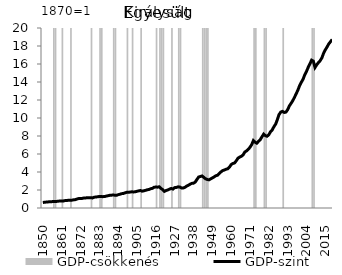
| Category | GDP-csökkenés |
|---|---|
| 1850.0 | 0 |
| 1851.0 | 0 |
| 1852.0 | 0 |
| 1853.0 | 0 |
| 1854.0 | 0 |
| 1855.0 | 0 |
| 1856.0 | 0 |
| 1857.0 | 20 |
| 1858.0 | 20 |
| 1859.0 | 0 |
| 1860.0 | 0 |
| 1861.0 | 0 |
| 1862.0 | 20 |
| 1863.0 | 0 |
| 1864.0 | 0 |
| 1865.0 | 0 |
| 1866.0 | 0 |
| 1867.0 | 20 |
| 1868.0 | 0 |
| 1869.0 | 0 |
| 1870.0 | 0 |
| 1871.0 | 0 |
| 1872.0 | 0 |
| 1873.0 | 0 |
| 1874.0 | 0 |
| 1875.0 | 0 |
| 1876.0 | 0 |
| 1877.0 | 0 |
| 1878.0 | 0 |
| 1879.0 | 20 |
| 1880.0 | 0 |
| 1881.0 | 0 |
| 1882.0 | 0 |
| 1883.0 | 0 |
| 1884.0 | 20 |
| 1885.0 | 20 |
| 1886.0 | 0 |
| 1887.0 | 0 |
| 1888.0 | 0 |
| 1889.0 | 0 |
| 1890.0 | 0 |
| 1891.0 | 0 |
| 1892.0 | 20 |
| 1893.0 | 20 |
| 1894.0 | 0 |
| 1895.0 | 0 |
| 1896.0 | 0 |
| 1897.0 | 0 |
| 1898.0 | 0 |
| 1899.0 | 0 |
| 1900.0 | 20 |
| 1901.0 | 0 |
| 1902.0 | 0 |
| 1903.0 | 20 |
| 1904.0 | 0 |
| 1905.0 | 0 |
| 1906.0 | 0 |
| 1907.0 | 0 |
| 1908.0 | 20 |
| 1909.0 | 0 |
| 1910.0 | 0 |
| 1911.0 | 0 |
| 1912.0 | 0 |
| 1913.0 | 0 |
| 1914.0 | 0 |
| 1915.0 | 0 |
| 1916.0 | 0 |
| 1917.0 | 20 |
| 1918.0 | 0 |
| 1919.0 | 20 |
| 1920.0 | 20 |
| 1921.0 | 20 |
| 1922.0 | 0 |
| 1923.0 | 0 |
| 1924.0 | 0 |
| 1925.0 | 0 |
| 1926.0 | 20 |
| 1927.0 | 0 |
| 1928.0 | 0 |
| 1929.0 | 0 |
| 1930.0 | 20 |
| 1931.0 | 20 |
| 1932.0 | 0 |
| 1933.0 | 0 |
| 1934.0 | 0 |
| 1935.0 | 0 |
| 1936.0 | 0 |
| 1937.0 | 0 |
| 1938.0 | 0 |
| 1939.0 | 0 |
| 1940.0 | 0 |
| 1941.0 | 0 |
| 1942.0 | 0 |
| 1943.0 | 0 |
| 1944.0 | 20 |
| 1945.0 | 20 |
| 1946.0 | 20 |
| 1947.0 | 20 |
| 1948.0 | 0 |
| 1949.0 | 0 |
| 1950.0 | 0 |
| 1951.0 | 0 |
| 1952.0 | 0 |
| 1953.0 | 0 |
| 1954.0 | 0 |
| 1955.0 | 0 |
| 1956.0 | 0 |
| 1957.0 | 0 |
| 1958.0 | 0 |
| 1959.0 | 0 |
| 1960.0 | 0 |
| 1961.0 | 0 |
| 1962.0 | 0 |
| 1963.0 | 0 |
| 1964.0 | 0 |
| 1965.0 | 0 |
| 1966.0 | 0 |
| 1967.0 | 0 |
| 1968.0 | 0 |
| 1969.0 | 0 |
| 1970.0 | 0 |
| 1971.0 | 0 |
| 1972.0 | 0 |
| 1973.0 | 0 |
| 1974.0 | 20 |
| 1975.0 | 20 |
| 1976.0 | 0 |
| 1977.0 | 0 |
| 1978.0 | 0 |
| 1979.0 | 0 |
| 1980.0 | 20 |
| 1981.0 | 20 |
| 1982.0 | 0 |
| 1983.0 | 0 |
| 1984.0 | 0 |
| 1985.0 | 0 |
| 1986.0 | 0 |
| 1987.0 | 0 |
| 1988.0 | 0 |
| 1989.0 | 0 |
| 1990.0 | 0 |
| 1991.0 | 20 |
| 1992.0 | 0 |
| 1993.0 | 0 |
| 1994.0 | 0 |
| 1995.0 | 0 |
| 1996.0 | 0 |
| 1997.0 | 0 |
| 1998.0 | 0 |
| 1999.0 | 0 |
| 2000.0 | 0 |
| 2001.0 | 0 |
| 2002.0 | 0 |
| 2003.0 | 0 |
| 2004.0 | 0 |
| 2005.0 | 0 |
| 2006.0 | 0 |
| 2007.0 | 0 |
| 2008.0 | 20 |
| 2009.0 | 20 |
| 2010.0 | 0 |
| 2011.0 | 0 |
| 2012.0 | 0 |
| 2013.0 | 0 |
| 2014.0 | 0 |
| 2015.0 | 0 |
| 2016.0 | 0 |
| 2017.0 | 0 |
| 2018.0 | 0 |
| 2019.0 | 0 |